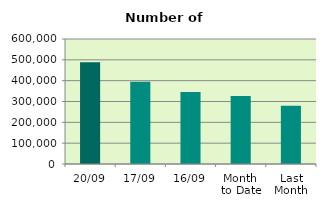
| Category | Series 0 |
|---|---|
| 20/09 | 488112 |
| 17/09 | 394834 |
| 16/09 | 346032 |
| Month 
to Date | 326419.714 |
| Last
Month | 279794.182 |